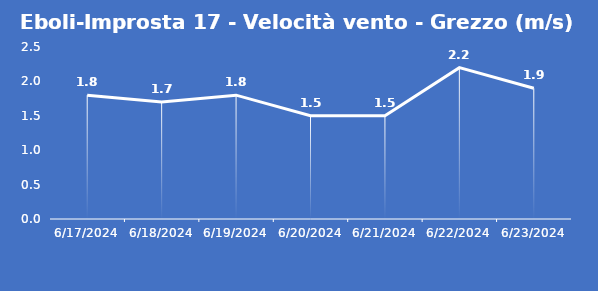
| Category | Eboli-Improsta 17 - Velocità vento - Grezzo (m/s) |
|---|---|
| 6/17/24 | 1.8 |
| 6/18/24 | 1.7 |
| 6/19/24 | 1.8 |
| 6/20/24 | 1.5 |
| 6/21/24 | 1.5 |
| 6/22/24 | 2.2 |
| 6/23/24 | 1.9 |